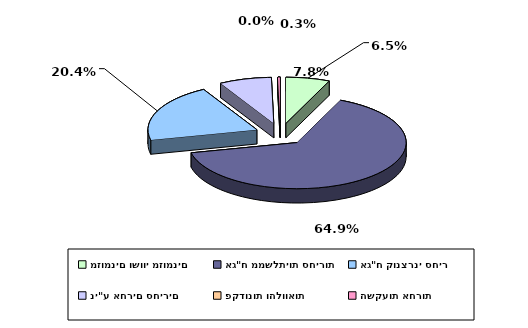
| Category | Series 0 |
|---|---|
| מזומנים ושווי מזומנים | 0.065 |
| אג"ח ממשלתיות סחירות | 0.649 |
| אג"ח קונצרני סחיר | 0.204 |
| ני"ע אחרים סחירים | 0.078 |
| פקדונות והלוואות | 0 |
| השקעות אחרות | 0.003 |